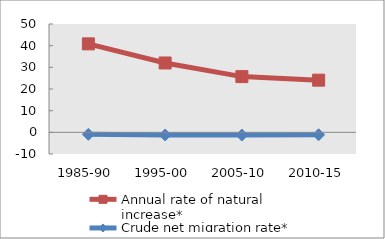
| Category | Annual rate of natural increase* | Crude net migration rate* |
|---|---|---|
| 1985-90 | 40.835 | -0.933 |
| 1995-00 | 32.013 | -1.229 |
| 2005-10 | 25.717 | -1.259 |
| 2010-15 | 24.076 | -1.118 |